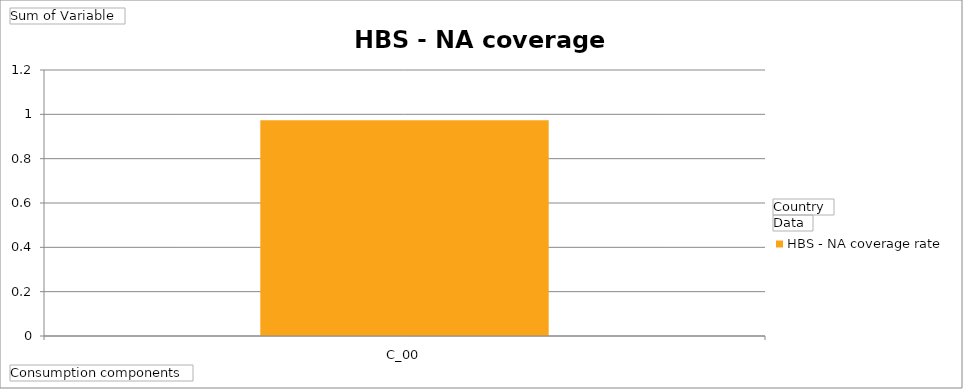
| Category | DK - HBS - NA coverage rate |
|---|---|
| C_00 | 0.973 |